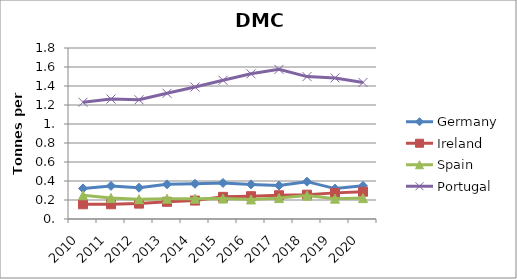
| Category | Germany | Ireland | Spain | Portugal |
|---|---|---|---|---|
| 2010 | 0.322 | 0.155 | 0.25 | 1.229 |
| 2011 | 0.348 | 0.155 | 0.222 | 1.263 |
| 2012 | 0.329 | 0.162 | 0.209 | 1.255 |
| 2013 | 0.365 | 0.181 | 0.214 | 1.323 |
| 2014 | 0.371 | 0.194 | 0.214 | 1.389 |
| 2015 | 0.379 | 0.233 | 0.215 | 1.46 |
| 2016 | 0.364 | 0.24 | 0.206 | 1.528 |
| 2017 | 0.352 | 0.25 | 0.22 | 1.575 |
| 2018 | 0.393 | 0.256 | 0.246 | 1.499 |
| 2019 | 0.32 | 0.275 | 0.214 | 1.485 |
| 2020 | 0.349 | 0.287 | 0.22 | 1.437 |